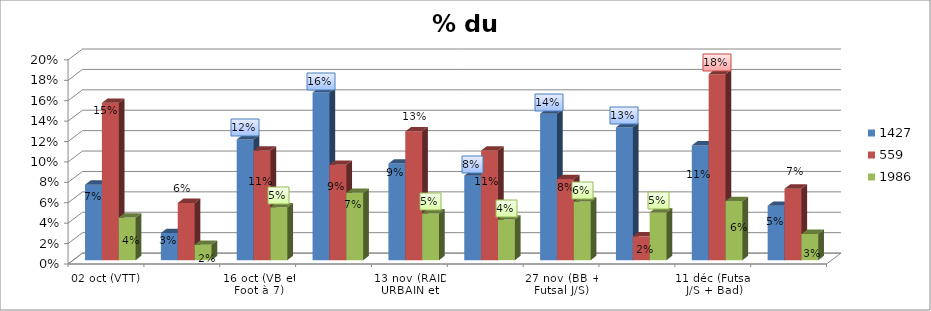
| Category | 1427 | 559 | 1986 |
|---|---|---|---|
| 02 oct (VTT) | 0.074 | 0.154 | 0.042 |
| 09 oct (Badminton et Rugby) | 0.027 | 0.056 | 0.015 |
| 16 oct (VB et Foot à 7) | 0.118 | 0.107 | 0.052 |
| 6 nov (BB et Futsal) | 0.164 | 0.093 | 0.066 |
| 13 nov (RAID URBAIN et VB) | 0.095 | 0.126 | 0.046 |
| 20 nov (Bad + Choré coll + Futsal J/S) | 0.083 | 0.107 | 0.04 |
| 27 nov (BB + Futsal J/S) | 0.143 | 0.079 | 0.057 |
| 04 déc (BB interdistrict+ Futsal Cadets + Futsal Filles) | 0.13 | 0.023 | 0.047 |
| 11 déc (Futsal J/S + Bad) | 0.112 | 0.182 | 0.058 |
| 18 déc (BB) | 0.053 | 0.07 | 0.026 |